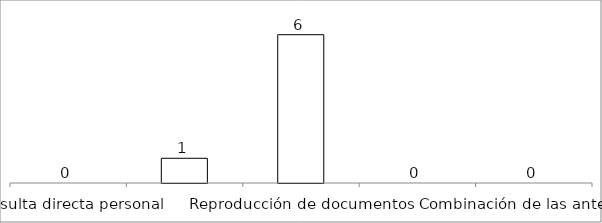
| Category | Series 0 |
|---|---|
| Consulta directa personal | 0 |
| Consulta directa electrónica | 1 |
| Reproducción de documentos | 6 |
| Elaboración de informes | 0 |
| Combinación de las anteriores | 0 |